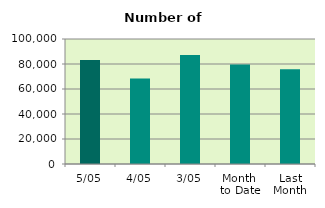
| Category | Series 0 |
|---|---|
| 5/05 | 83198 |
| 4/05 | 68466 |
| 3/05 | 87140 |
| Month 
to Date | 79601.333 |
| Last
Month | 75814.526 |